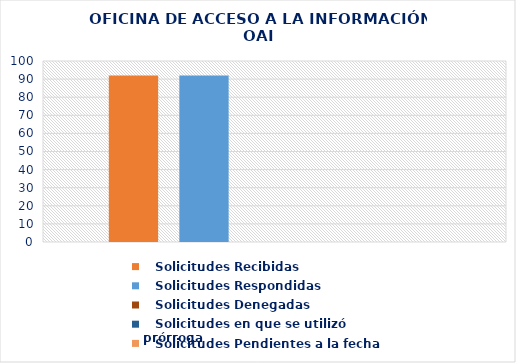
| Category |    Solicitudes Recibidas |    Solicitudes Respondidas |    Solicitudes Denegadas |    Solicitudes en que se utilizó prórroga |    Solicitudes Pendientes a la fecha |
|---|---|---|---|---|---|
| 0 | 92 | 92 | 0 | 0 | 0 |